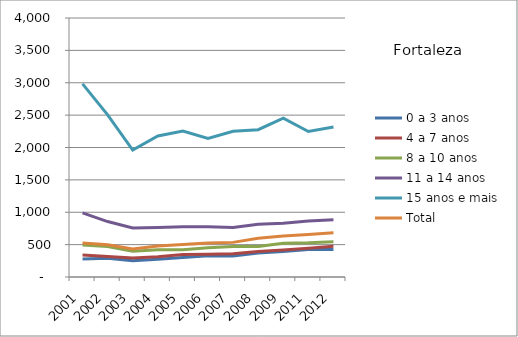
| Category | 0 a 3 anos | 4 a 7 anos | 8 a 10 anos | 11 a 14 anos | 15 anos e mais | Total |
|---|---|---|---|---|---|---|
| 2001.0 | 278.33 | 339.57 | 494.07 | 989.83 | 2983.13 | 524.53 |
| 2002.0 | 290.09 | 316.99 | 470.37 | 856.15 | 2504.86 | 497.12 |
| 2003.0 | 250.3 | 293.4 | 396.4 | 756.33 | 1960.92 | 432.62 |
| 2004.0 | 273.31 | 313.42 | 421.02 | 763.17 | 2178.23 | 480.44 |
| 2005.0 | 299.78 | 349.21 | 421.28 | 777.33 | 2253.19 | 503.61 |
| 2006.0 | 326.3 | 352.47 | 452.91 | 775.08 | 2138.32 | 524.59 |
| 2007.0 | 324.53 | 358.53 | 470.4 | 766.3 | 2249.76 | 534.71 |
| 2008.0 | 369.82 | 393.94 | 472.51 | 815.57 | 2274.89 | 597.34 |
| 2009.0 | 392.69 | 417.43 | 519.78 | 828.8 | 2454.39 | 634.01 |
| 2011.0 | 423.64 | 442.5 | 527.92 | 863.18 | 2246.71 | 658.14 |
| 2012.0 | 426.36 | 474.55 | 544.74 | 884.87 | 2317.24 | 682.9 |